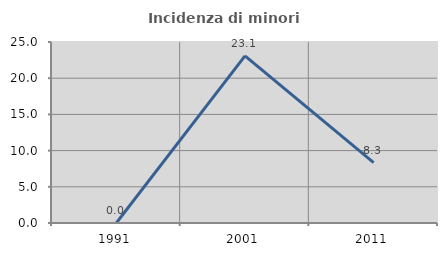
| Category | Incidenza di minori stranieri |
|---|---|
| 1991.0 | 0 |
| 2001.0 | 23.077 |
| 2011.0 | 8.333 |